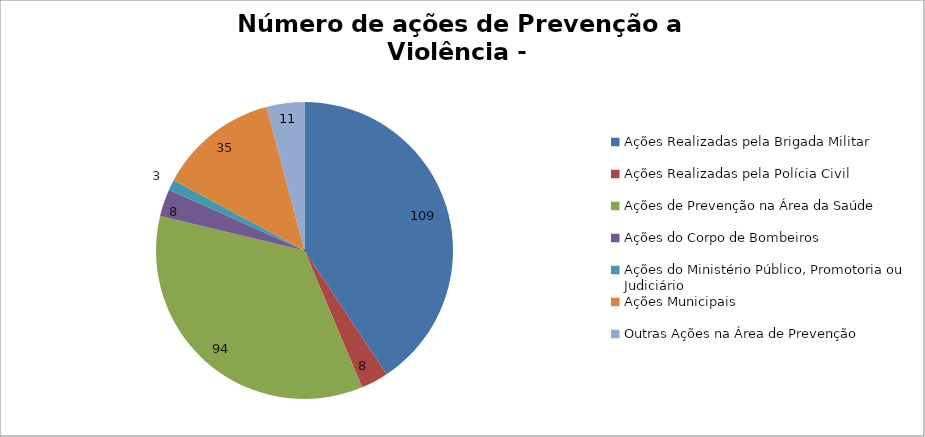
| Category | Número de Ações |
|---|---|
| Ações Realizadas pela Brigada Militar | 109 |
| Ações Realizadas pela Polícia Civil | 8 |
| Ações de Prevenção na Área da Saúde | 94 |
| Ações do Corpo de Bombeiros | 8 |
| Ações do Ministério Público, Promotoria ou Judiciário | 3 |
| Ações Municipais | 35 |
| Outras Ações na Área de Prevenção | 11 |